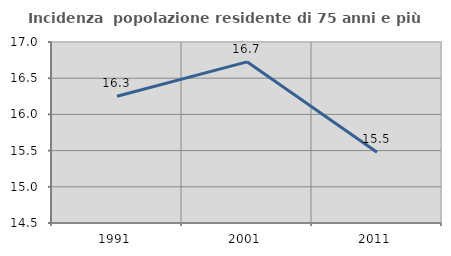
| Category | Incidenza  popolazione residente di 75 anni e più |
|---|---|
| 1991.0 | 16.25 |
| 2001.0 | 16.726 |
| 2011.0 | 15.476 |